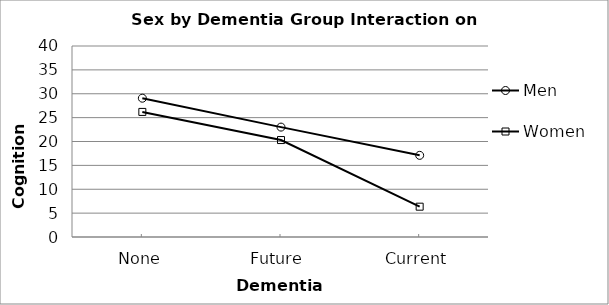
| Category | Men | Women | Series 2 |
|---|---|---|---|
| None | 29.07 | 26.195 |  |
| Future | 23.014 | 20.303 |  |
| Current | 17.099 | 6.349 |  |